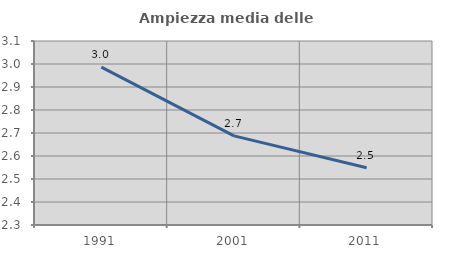
| Category | Ampiezza media delle famiglie |
|---|---|
| 1991.0 | 2.986 |
| 2001.0 | 2.688 |
| 2011.0 | 2.549 |